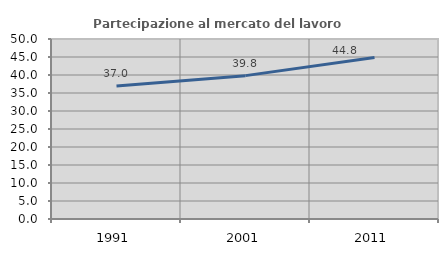
| Category | Partecipazione al mercato del lavoro  femminile |
|---|---|
| 1991.0 | 36.977 |
| 2001.0 | 39.824 |
| 2011.0 | 44.837 |